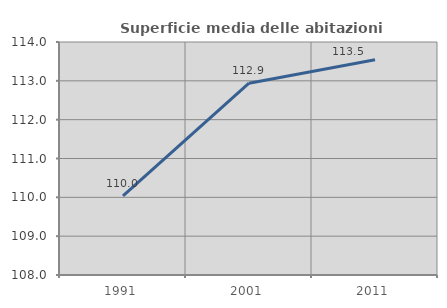
| Category | Superficie media delle abitazioni occupate |
|---|---|
| 1991.0 | 110.036 |
| 2001.0 | 112.94 |
| 2011.0 | 113.542 |